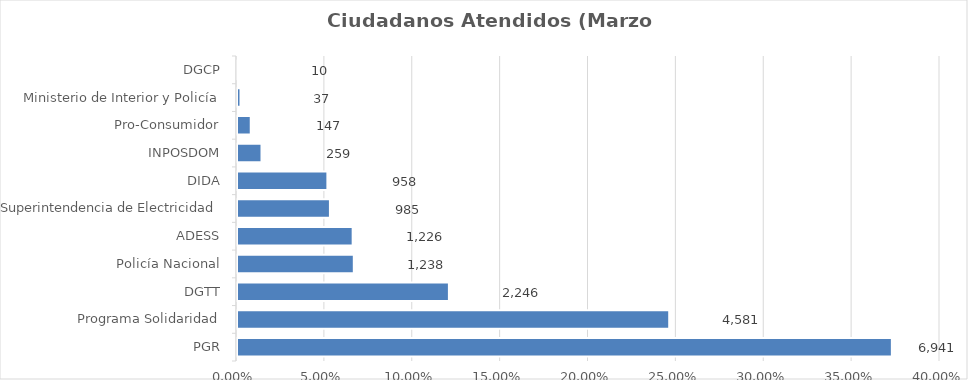
| Category | Porcentaje |
|---|---|
| PGR | 0.373 |
| Programa Solidaridad | 0.246 |
| DGTT | 0.121 |
| Policía Nacional | 0.066 |
| ADESS | 0.066 |
| Superintendencia de Electricidad | 0.053 |
| DIDA | 0.051 |
| INPOSDOM | 0.014 |
| Pro-Consumidor | 0.008 |
| Ministerio de Interior y Policía | 0.002 |
| DGCP | 0.001 |